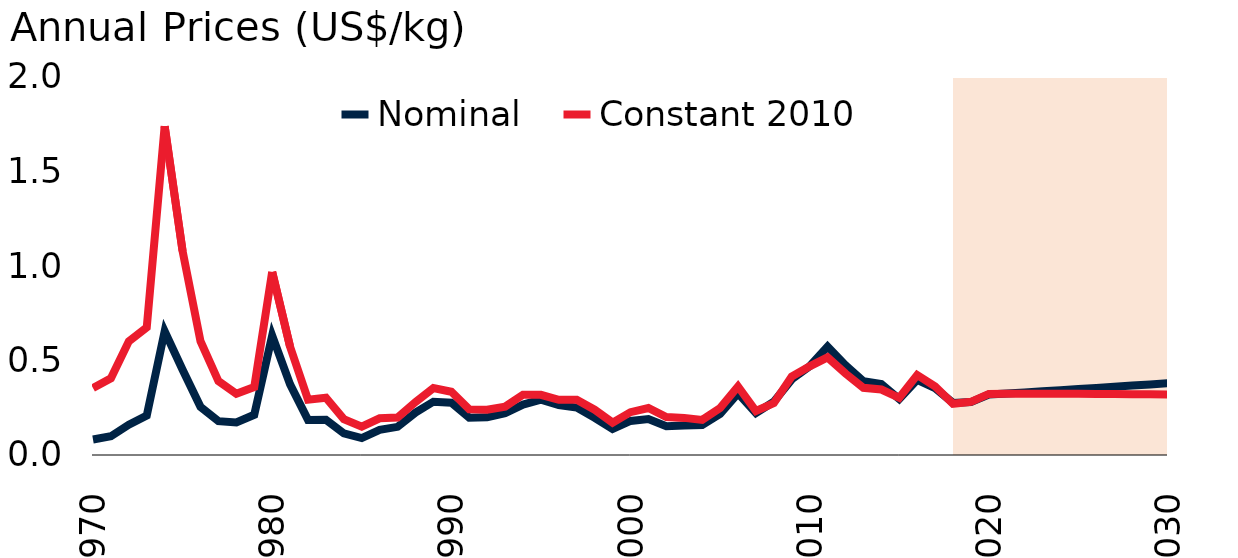
| Category | Nominal | Constant 2010 |
|---|---|---|
| 1970.0 | 0.082 | 0.354 |
| 1971.0 | 0.099 | 0.406 |
| 1972.0 | 0.16 | 0.602 |
| 1973.0 | 0.209 | 0.675 |
| 1974.0 | 0.655 | 1.74 |
| 1975.0 | 0.451 | 1.079 |
| 1976.0 | 0.255 | 0.602 |
| 1977.0 | 0.179 | 0.391 |
| 1978.0 | 0.172 | 0.324 |
| 1979.0 | 0.213 | 0.359 |
| 1980.0 | 0.632 | 0.968 |
| 1981.0 | 0.374 | 0.573 |
| 1982.0 | 0.186 | 0.293 |
| 1983.0 | 0.187 | 0.303 |
| 1984.0 | 0.115 | 0.19 |
| 1985.0 | 0.089 | 0.15 |
| 1986.0 | 0.133 | 0.194 |
| 1987.0 | 0.149 | 0.198 |
| 1988.0 | 0.225 | 0.28 |
| 1989.0 | 0.282 | 0.354 |
| 1990.0 | 0.277 | 0.335 |
| 1991.0 | 0.198 | 0.241 |
| 1992.0 | 0.2 | 0.239 |
| 1993.0 | 0.221 | 0.256 |
| 1994.0 | 0.267 | 0.319 |
| 1995.0 | 0.293 | 0.319 |
| 1996.0 | 0.264 | 0.292 |
| 1997.0 | 0.251 | 0.292 |
| 1998.0 | 0.197 | 0.239 |
| 1999.0 | 0.138 | 0.171 |
| 2000.0 | 0.18 | 0.227 |
| 2001.0 | 0.19 | 0.249 |
| 2002.0 | 0.152 | 0.201 |
| 2003.0 | 0.156 | 0.196 |
| 2004.0 | 0.158 | 0.186 |
| 2005.0 | 0.218 | 0.248 |
| 2006.0 | 0.326 | 0.362 |
| 2007.0 | 0.222 | 0.233 |
| 2008.0 | 0.282 | 0.274 |
| 2009.0 | 0.4 | 0.415 |
| 2010.0 | 0.469 | 0.469 |
| 2011.0 | 0.573 | 0.516 |
| 2012.0 | 0.475 | 0.431 |
| 2013.0 | 0.39 | 0.356 |
| 2014.0 | 0.375 | 0.347 |
| 2015.0 | 0.296 | 0.303 |
| 2016.0 | 0.398 | 0.423 |
| 2017.0 | 0.353 | 0.363 |
| 2018.0 | 0.276 | 0.271 |
| 2019.0 | 0.28 | 0.281 |
| 2020.0 | 0.32 | 0.323 |
| 2021.0 | 0.326 | 0.324 |
| 2022.0 | 0.331 | 0.324 |
| 2023.0 | 0.337 | 0.324 |
| 2024.0 | 0.343 | 0.324 |
| 2025.0 | 0.349 | 0.323 |
| 2026.0 | 0.355 | 0.323 |
| 2027.0 | 0.361 | 0.323 |
| 2028.0 | 0.367 | 0.322 |
| 2029.0 | 0.374 | 0.321 |
| 2030.0 | 0.38 | 0.321 |